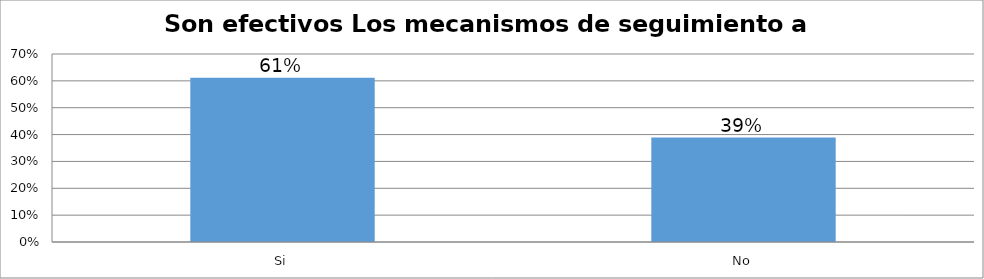
| Category | Series 0 |
|---|---|
| Si | 0.611 |
| No | 0.389 |